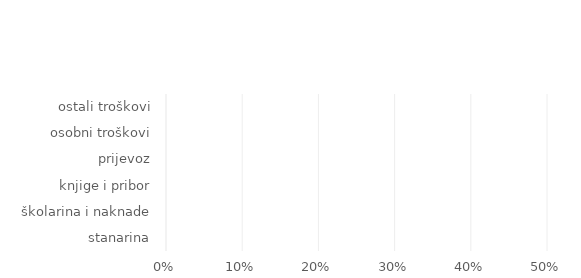
| Category | Series 0 |
|---|---|
| stanarina | 0 |
| školarina i naknade | 0 |
| knjige i pribor | 0 |
| prijevoz | 0 |
| osobni troškovi | 0 |
| ostali troškovi | 0 |